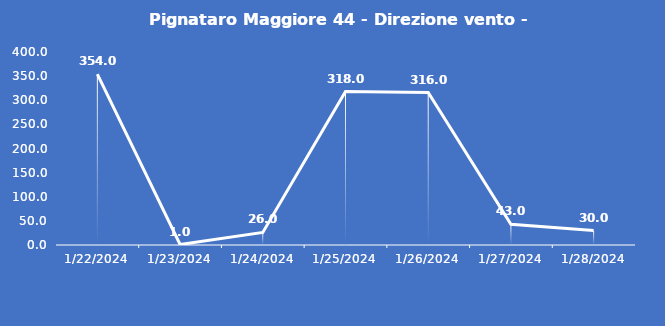
| Category | Pignataro Maggiore 44 - Direzione vento - Grezzo (°N) |
|---|---|
| 1/22/24 | 354 |
| 1/23/24 | 1 |
| 1/24/24 | 26 |
| 1/25/24 | 318 |
| 1/26/24 | 316 |
| 1/27/24 | 43 |
| 1/28/24 | 30 |